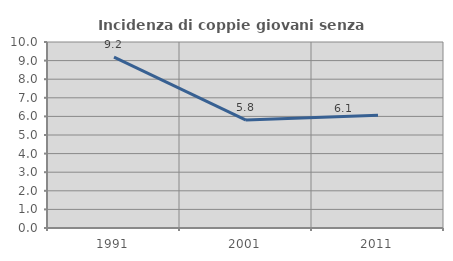
| Category | Incidenza di coppie giovani senza figli |
|---|---|
| 1991.0 | 9.189 |
| 2001.0 | 5.804 |
| 2011.0 | 6.061 |